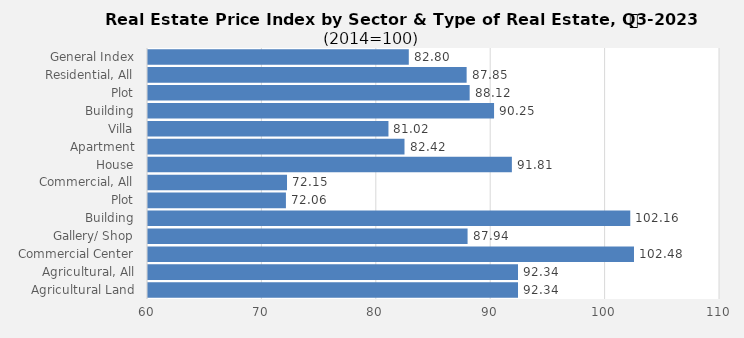
| Category | 2023 |
|---|---|
| General Index | 82.797 |
| Residential, All | 87.853 |
| Plot | 88.117 |
| Building | 90.25 |
| Villa | 81.019 |
| Apartment | 82.422 |
| House | 91.807 |
| Commercial, All | 72.152 |
| Plot | 72.056 |
| Building | 102.156 |
| Gallery/ Shop | 87.935 |
| Commercial Center | 102.482 |
| Agricultural, All | 92.343 |
| Agricultural Land | 92.343 |